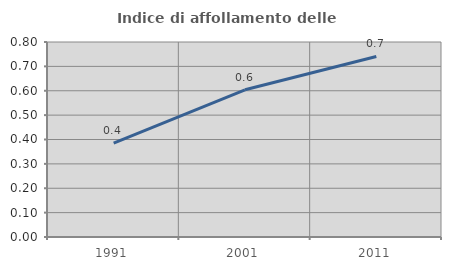
| Category | Indice di affollamento delle abitazioni  |
|---|---|
| 1991.0 | 0.385 |
| 2001.0 | 0.604 |
| 2011.0 | 0.741 |